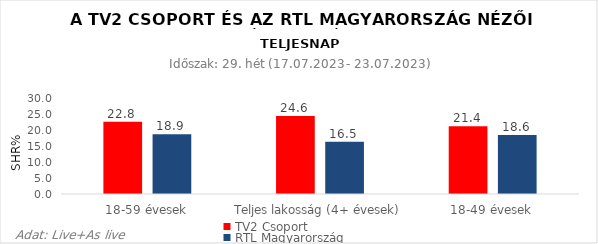
| Category | TV2 Csoport | RTL Magyarország |
|---|---|---|
| 18-59 évesek | 22.8 | 18.9 |
| Teljes lakosság (4+ évesek) | 24.6 | 16.5 |
| 18-49 évesek | 21.4 | 18.6 |